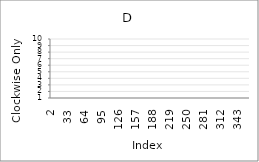
| Category | Series 0 |
|---|---|
| 2.0 | 9 |
| 3.0 | 7 |
| 4.0 | 2 |
| 5.0 | 1 |
| 6.0 | 10 |
| 7.0 | 7 |
| 8.0 | 4 |
| 9.0 | 3 |
| 10.0 | 10 |
| 11.0 | 6 |
| 12.0 | 2 |
| 13.0 | 9 |
| 14.0 | 3 |
| 15.0 | 7 |
| 16.0 | 2 |
| 17.0 | 3 |
| 18.0 | 4 |
| 19.0 | 6 |
| 20.0 | 5 |
| 21.0 | 8 |
| 22.0 | 5 |
| 23.0 | 4 |
| 24.0 | 7 |
| 25.0 | 6 |
| 26.0 | 1 |
| 27.0 | 10 |
| 28.0 | 10 |
| 29.0 | 5 |
| 30.0 | 5 |
| 31.0 | 99 |
| 32.0 | 99 |
| 33.0 | 99 |
| 34.0 | 99 |
| 35.0 | 99 |
| 36.0 | 99 |
| 37.0 | 99 |
| 38.0 | 99 |
| 39.0 | 99 |
| 40.0 | 99 |
| 41.0 | 99 |
| 42.0 | 99 |
| 43.0 | 99 |
| 44.0 | 99 |
| 45.0 | 99 |
| 46.0 | 99 |
| 47.0 | 99 |
| 48.0 | 99 |
| 49.0 | 99 |
| 50.0 | 99 |
| 51.0 | 99 |
| 52.0 | 99 |
| 53.0 | 99 |
| 54.0 | 99 |
| 55.0 | 99 |
| 56.0 | 99 |
| 57.0 | 99 |
| 58.0 | 99 |
| 59.0 | 99 |
| 60.0 | 99 |
| 61.0 | 99 |
| 62.0 | 99 |
| 63.0 | 99 |
| 64.0 | 99 |
| 65.0 | 99 |
| 66.0 | 99 |
| 67.0 | 99 |
| 68.0 | 99 |
| 69.0 | 99 |
| 70.0 | 99 |
| 71.0 | 99 |
| 72.0 | 99 |
| 73.0 | 99 |
| 74.0 | 99 |
| 75.0 | 99 |
| 76.0 | 99 |
| 77.0 | 99 |
| 78.0 | 99 |
| 79.0 | 99 |
| 80.0 | 99 |
| 81.0 | 99 |
| 82.0 | 99 |
| 83.0 | 99 |
| 84.0 | 99 |
| 85.0 | 99 |
| 86.0 | 99 |
| 87.0 | 99 |
| 88.0 | 99 |
| 89.0 | 99 |
| 90.0 | 99 |
| 91.0 | 99 |
| 92.0 | 99 |
| 93.0 | 99 |
| 94.0 | 99 |
| 95.0 | 99 |
| 96.0 | 99 |
| 97.0 | 99 |
| 98.0 | 99 |
| 99.0 | 99 |
| 100.0 | 99 |
| 101.0 | 99 |
| 102.0 | 99 |
| 103.0 | 99 |
| 104.0 | 99 |
| 105.0 | 99 |
| 106.0 | 99 |
| 107.0 | 99 |
| 108.0 | 99 |
| 109.0 | 99 |
| 110.0 | 99 |
| 111.0 | 99 |
| 112.0 | 99 |
| 113.0 | 99 |
| 114.0 | 99 |
| 115.0 | 99 |
| 116.0 | 99 |
| 117.0 | 99 |
| 118.0 | 99 |
| 119.0 | 99 |
| 120.0 | 99 |
| 121.0 | 99 |
| 122.0 | 99 |
| 123.0 | 99 |
| 124.0 | 99 |
| 125.0 | 99 |
| 126.0 | 99 |
| 127.0 | 99 |
| 128.0 | 99 |
| 129.0 | 99 |
| 130.0 | 99 |
| 131.0 | 99 |
| 132.0 | 99 |
| 133.0 | 99 |
| 134.0 | 99 |
| 135.0 | 99 |
| 136.0 | 99 |
| 137.0 | 99 |
| 138.0 | 99 |
| 139.0 | 99 |
| 140.0 | 99 |
| 141.0 | 99 |
| 142.0 | 99 |
| 143.0 | 99 |
| 144.0 | 99 |
| 145.0 | 99 |
| 146.0 | 99 |
| 147.0 | 99 |
| 148.0 | 99 |
| 149.0 | 99 |
| 150.0 | 99 |
| 151.0 | 99 |
| 152.0 | 99 |
| 153.0 | 99 |
| 154.0 | 99 |
| 155.0 | 99 |
| 156.0 | 99 |
| 157.0 | 99 |
| 158.0 | 99 |
| 159.0 | 99 |
| 160.0 | 99 |
| 161.0 | 99 |
| 162.0 | 99 |
| 163.0 | 99 |
| 164.0 | 99 |
| 165.0 | 99 |
| 166.0 | 99 |
| 167.0 | 99 |
| 168.0 | 99 |
| 169.0 | 99 |
| 170.0 | 99 |
| 171.0 | 99 |
| 172.0 | 99 |
| 173.0 | 99 |
| 174.0 | 99 |
| 175.0 | 99 |
| 176.0 | 99 |
| 177.0 | 99 |
| 178.0 | 99 |
| 179.0 | 99 |
| 180.0 | 99 |
| 181.0 | 99 |
| 182.0 | 99 |
| 183.0 | 99 |
| 184.0 | 99 |
| 185.0 | 99 |
| 186.0 | 99 |
| 187.0 | 99 |
| 188.0 | 99 |
| 189.0 | 99 |
| 190.0 | 99 |
| 191.0 | 99 |
| 192.0 | 99 |
| 193.0 | 99 |
| 194.0 | 99 |
| 195.0 | 99 |
| 196.0 | 99 |
| 197.0 | 99 |
| 198.0 | 99 |
| 199.0 | 99 |
| 200.0 | 99 |
| 201.0 | 99 |
| 202.0 | 99 |
| 203.0 | 99 |
| 204.0 | 99 |
| 205.0 | 99 |
| 206.0 | 99 |
| 207.0 | 99 |
| 208.0 | 99 |
| 209.0 | 99 |
| 210.0 | 99 |
| 211.0 | 99 |
| 212.0 | 99 |
| 213.0 | 99 |
| 214.0 | 99 |
| 215.0 | 99 |
| 216.0 | 99 |
| 217.0 | 99 |
| 218.0 | 99 |
| 219.0 | 99 |
| 220.0 | 99 |
| 221.0 | 99 |
| 222.0 | 99 |
| 223.0 | 99 |
| 224.0 | 99 |
| 225.0 | 99 |
| 226.0 | 99 |
| 227.0 | 99 |
| 228.0 | 99 |
| 229.0 | 99 |
| 230.0 | 99 |
| 231.0 | 99 |
| 232.0 | 99 |
| 233.0 | 99 |
| 234.0 | 99 |
| 235.0 | 99 |
| 236.0 | 99 |
| 237.0 | 99 |
| 238.0 | 99 |
| 239.0 | 99 |
| 240.0 | 99 |
| 241.0 | 99 |
| 242.0 | 99 |
| 243.0 | 99 |
| 244.0 | 99 |
| 245.0 | 99 |
| 246.0 | 99 |
| 247.0 | 99 |
| 248.0 | 99 |
| 249.0 | 99 |
| 250.0 | 99 |
| 251.0 | 99 |
| 252.0 | 99 |
| 253.0 | 99 |
| 254.0 | 99 |
| 255.0 | 99 |
| 256.0 | 99 |
| 257.0 | 99 |
| 258.0 | 99 |
| 259.0 | 99 |
| 260.0 | 99 |
| 261.0 | 99 |
| 262.0 | 99 |
| 263.0 | 99 |
| 264.0 | 99 |
| 265.0 | 99 |
| 266.0 | 99 |
| 267.0 | 99 |
| 268.0 | 99 |
| 269.0 | 99 |
| 270.0 | 99 |
| 271.0 | 99 |
| 272.0 | 99 |
| 273.0 | 99 |
| 274.0 | 99 |
| 275.0 | 99 |
| 276.0 | 99 |
| 277.0 | 99 |
| 278.0 | 99 |
| 279.0 | 99 |
| 280.0 | 99 |
| 281.0 | 99 |
| 282.0 | 99 |
| 283.0 | 99 |
| 284.0 | 99 |
| 285.0 | 99 |
| 286.0 | 99 |
| 287.0 | 99 |
| 288.0 | 99 |
| 289.0 | 99 |
| 290.0 | 99 |
| 291.0 | 99 |
| 292.0 | 99 |
| 293.0 | 99 |
| 294.0 | 99 |
| 295.0 | 99 |
| 296.0 | 99 |
| 297.0 | 99 |
| 298.0 | 99 |
| 299.0 | 99 |
| 300.0 | 99 |
| 301.0 | 99 |
| 302.0 | 99 |
| 303.0 | 99 |
| 304.0 | 99 |
| 305.0 | 99 |
| 306.0 | 99 |
| 307.0 | 99 |
| 308.0 | 99 |
| 309.0 | 99 |
| 310.0 | 99 |
| 311.0 | 99 |
| 312.0 | 99 |
| 313.0 | 99 |
| 314.0 | 99 |
| 315.0 | 99 |
| 316.0 | 99 |
| 317.0 | 99 |
| 318.0 | 99 |
| 319.0 | 99 |
| 320.0 | 99 |
| 321.0 | 99 |
| 322.0 | 99 |
| 323.0 | 99 |
| 324.0 | 99 |
| 325.0 | 99 |
| 326.0 | 99 |
| 327.0 | 99 |
| 328.0 | 99 |
| 329.0 | 99 |
| 330.0 | 99 |
| 331.0 | 99 |
| 332.0 | 99 |
| 333.0 | 99 |
| 334.0 | 99 |
| 335.0 | 99 |
| 336.0 | 99 |
| 337.0 | 99 |
| 338.0 | 99 |
| 339.0 | 99 |
| 340.0 | 99 |
| 341.0 | 99 |
| 342.0 | 99 |
| 343.0 | 99 |
| 344.0 | 99 |
| 345.0 | 99 |
| 346.0 | 99 |
| 347.0 | 99 |
| 348.0 | 99 |
| 349.0 | 99 |
| 350.0 | 99 |
| 351.0 | 99 |
| 352.0 | 99 |
| 353.0 | 99 |
| 354.0 | 99 |
| 355.0 | 99 |
| 356.0 | 99 |
| 357.0 | 99 |
| 358.0 | 99 |
| 359.0 | 99 |
| 360.0 | 99 |
| 361.0 | 99 |
| 362.0 | 99 |
| 363.0 | 99 |
| 364.0 | 99 |
| 365.0 | 99 |